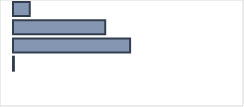
| Category | Series 0 |
|---|---|
| 0 | 7.389 |
| 1 | 40.622 |
| 2 | 51.593 |
| 3 | 0.396 |
| 4 | 0 |